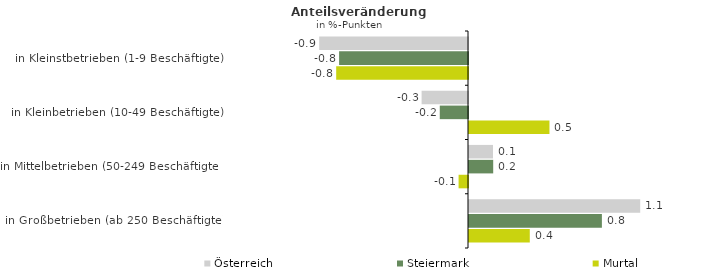
| Category | Österreich | Steiermark | Murtal |
|---|---|---|---|
| in Kleinstbetrieben (1-9 Beschäftigte) | -0.926 | -0.802 | -0.82 |
| in Kleinbetrieben (10-49 Beschäftigte) | -0.289 | -0.176 | 0.501 |
| in Mittelbetrieben (50-249 Beschäftigte) | 0.149 | 0.151 | -0.059 |
| in Großbetrieben (ab 250 Beschäftigte) | 1.066 | 0.827 | 0.378 |